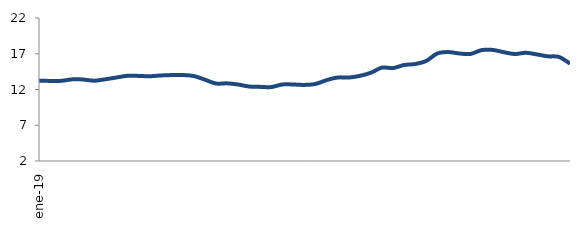
| Category | Series 0 |
|---|---|
| 2019-01-01 | 13.244 |
| 2019-02-01 | 13.198 |
| 2019-03-01 | 13.21 |
| 2019-04-01 | 13.419 |
| 2019-05-01 | 13.397 |
| 2019-06-01 | 13.231 |
| 2019-07-01 | 13.433 |
| 2019-08-01 | 13.679 |
| 2019-09-01 | 13.92 |
| 2019-10-01 | 13.901 |
| 2019-11-01 | 13.855 |
| 2019-12-01 | 13.96 |
| 2020-01-01 | 14.019 |
| 2020-02-01 | 14.026 |
| 2020-03-01 | 13.882 |
| 2020-04-01 | 13.374 |
| 2020-05-01 | 12.833 |
| 2020-06-01 | 12.862 |
| 2020-07-01 | 12.698 |
| 2020-08-01 | 12.414 |
| 2020-09-01 | 12.367 |
| 2020-10-01 | 12.342 |
| 2020-11-01 | 12.705 |
| 2020-12-01 | 12.699 |
| 2021-01-01 | 12.641 |
| 2021-02-01 | 12.779 |
| 2021-03-01 | 13.308 |
| 2021-04-01 | 13.679 |
| 2021-05-01 | 13.675 |
| 2021-06-01 | 13.905 |
| 2021-07-01 | 14.345 |
| 2021-08-01 | 15.059 |
| 2021-09-01 | 14.995 |
| 2021-10-01 | 15.427 |
| 2021-11-01 | 15.564 |
| 2021-12-01 | 15.993 |
| 2022-01-01 | 17.032 |
| 2022-02-01 | 17.239 |
| 2022-03-01 | 17.037 |
| 2022-04-01 | 16.972 |
| 2022-05-01 | 17.503 |
| 2022-06-01 | 17.537 |
| 2022-07-01 | 17.225 |
| 2022-08-01 | 16.961 |
| 2022-09-01 | 17.136 |
| 2022-10-01 | 16.906 |
| 2022-11-01 | 16.642 |
| 2022-12-01 | 16.555 |
| 2023-01-01 | 15.621 |